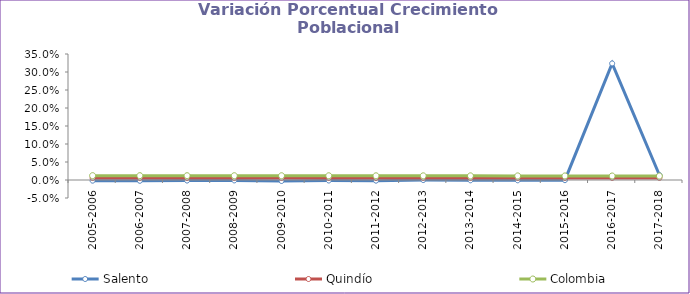
| Category | Salento | Quindío | Colombia |
|---|---|---|---|
| 2005-2006 | -0.002 | 0.006 | 0.012 |
| 2006-2007 | -0.002 | 0.006 | 0.012 |
| 2007-2008 | -0.002 | 0.006 | 0.012 |
| 2008-2009 | -0.001 | 0.006 | 0.012 |
| 2009-2010 | -0.003 | 0.006 | 0.012 |
| 2010-2011 | -0.001 | 0.006 | 0.012 |
| 2011-2012 | -0.002 | 0.006 | 0.012 |
| 2012-2013 | 0 | 0.006 | 0.012 |
| 2013-2014 | -0.001 | 0.006 | 0.011 |
| 2014-2015 | -0.001 | 0.006 | 0.011 |
| 2015-2016 | 0 | 0.006 | 0.011 |
| 2016-2017 | 0.324 | 0.006 | 0.011 |
| 2017-2018 | 0.014 | 0.006 | 0.011 |